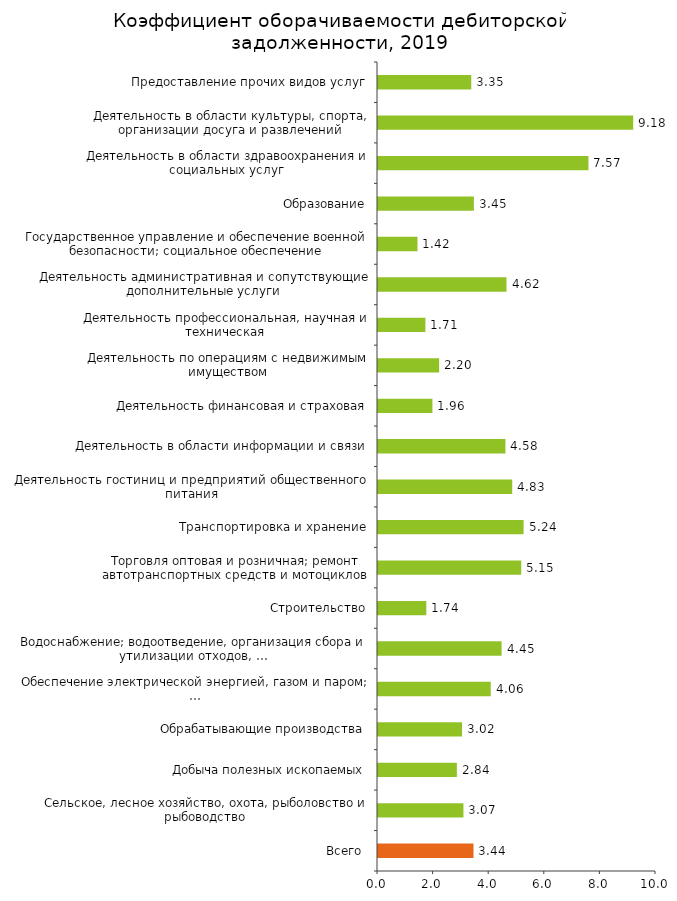
| Category | Series 0 |
|---|---|
| Всего  | 3.435 |
| Сельское, лесное хозяйство, охота, рыболовство и рыбоводство | 3.073 |
| Добыча полезных ископаемых | 2.837 |
| Обрабатывающие производства | 3.023 |
| Обеспечение электрической энергией, газом и паром; … | 4.056 |
| Водоснабжение; водоотведение, организация сбора и утилизации отходов, … | 4.446 |
| Строительство | 1.738 |
| Торговля оптовая и розничная; ремонт автотранспортных средств и мотоциклов | 5.152 |
| Транспортировка и хранение | 5.238 |
| Деятельность гостиниц и предприятий общественного питания | 4.827 |
| Деятельность в области информации и связи | 4.584 |
| Деятельность финансовая и страховая | 1.957 |
| Деятельность по операциям с недвижимым имуществом | 2.199 |
| Деятельность профессиональная, научная и техническая | 1.705 |
| Деятельность административная и сопутствующие дополнительные услуги | 4.623 |
| Государственное управление и обеспечение военной безопасности; социальное обеспечение | 1.42 |
| Образование | 3.448 |
| Деятельность в области здравоохранения и социальных услуг | 7.57 |
| Деятельность в области культуры, спорта, организации досуга и развлечений | 9.18 |
| Предоставление прочих видов услуг | 3.354 |